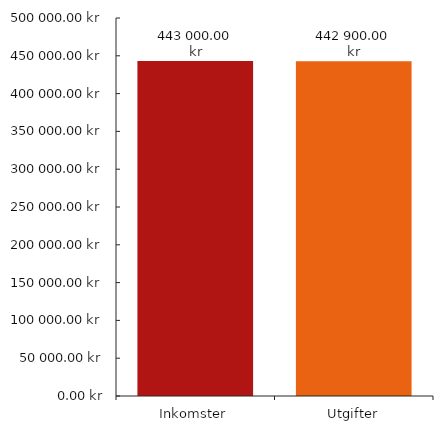
| Category | Diagramdata |
|---|---|
| 0 | 443000 |
| 1 | 442900 |